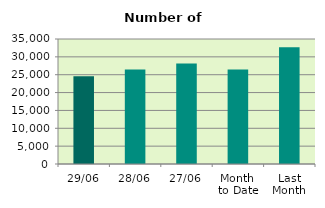
| Category | Series 0 |
|---|---|
| 29/06 | 24568 |
| 28/06 | 26442 |
| 27/06 | 28150 |
| Month 
to Date | 26483.143 |
| Last
Month | 32723.818 |